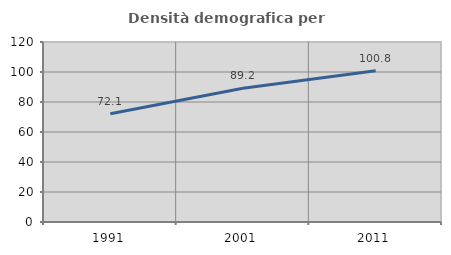
| Category | Densità demografica |
|---|---|
| 1991.0 | 72.119 |
| 2001.0 | 89.222 |
| 2011.0 | 100.848 |